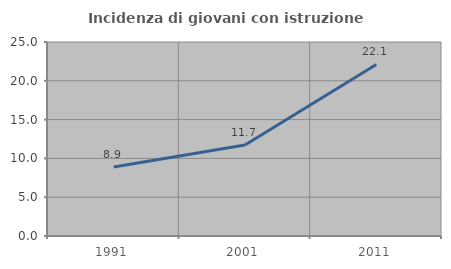
| Category | Incidenza di giovani con istruzione universitaria |
|---|---|
| 1991.0 | 8.879 |
| 2001.0 | 11.739 |
| 2011.0 | 22.112 |